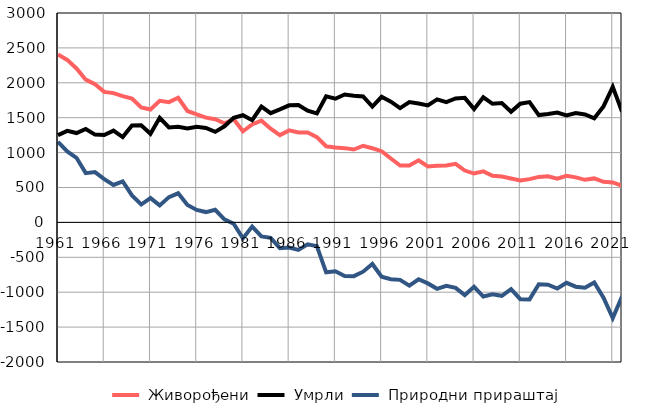
| Category |  Живорођени |  Умрли |  Природни прираштај |
|---|---|---|---|
| 1961.0 | 2405 | 1251 | 1154 |
| 1962.0 | 2328 | 1312 | 1016 |
| 1963.0 | 2205 | 1280 | 925 |
| 1964.0 | 2045 | 1339 | 706 |
| 1965.0 | 1979 | 1258 | 721 |
| 1966.0 | 1870 | 1251 | 619 |
| 1967.0 | 1852 | 1315 | 537 |
| 1968.0 | 1810 | 1222 | 588 |
| 1969.0 | 1774 | 1387 | 387 |
| 1970.0 | 1647 | 1391 | 256 |
| 1971.0 | 1618 | 1270 | 348 |
| 1972.0 | 1742 | 1499 | 243 |
| 1973.0 | 1723 | 1361 | 362 |
| 1974.0 | 1786 | 1369 | 417 |
| 1975.0 | 1596 | 1346 | 250 |
| 1976.0 | 1549 | 1371 | 178 |
| 1977.0 | 1501 | 1353 | 148 |
| 1978.0 | 1478 | 1297 | 181 |
| 1979.0 | 1420 | 1377 | 43 |
| 1980.0 | 1479 | 1499 | -20 |
| 1981.0 | 1306 | 1535 | -229 |
| 1982.0 | 1404 | 1464 | -60 |
| 1983.0 | 1458 | 1659 | -201 |
| 1984.0 | 1343 | 1565 | -222 |
| 1985.0 | 1250 | 1619 | -369 |
| 1986.0 | 1318 | 1677 | -359 |
| 1987.0 | 1288 | 1682 | -394 |
| 1988.0 | 1287 | 1601 | -314 |
| 1989.0 | 1222 | 1562 | -340 |
| 1990.0 | 1091 | 1806 | -715 |
| 1991.0 | 1073 | 1772 | -699 |
| 1992.0 | 1064 | 1833 | -769 |
| 1993.0 | 1044 | 1814 | -770 |
| 1994.0 | 1098 | 1804 | -706 |
| 1995.0 | 1062 | 1658 | -596 |
| 1996.0 | 1020 | 1799 | -779 |
| 1997.0 | 916 | 1730 | -814 |
| 1998.0 | 814 | 1637 | -823 |
| 1999.0 | 816 | 1723 | -907 |
| 2000.0 | 889 | 1704 | -815 |
| 2001.0 | 801 | 1675 | -874 |
| 2002.0 | 812 | 1763 | -951 |
| 2003.0 | 814 | 1722 | -908 |
| 2004.0 | 839 | 1776 | -937 |
| 2005.0 | 743 | 1784 | -1041 |
| 2006.0 | 700 | 1623 | -923 |
| 2007.0 | 731 | 1793 | -1062 |
| 2008.0 | 668 | 1699 | -1031 |
| 2009.0 | 658 | 1710 | -1052 |
| 2010.0 | 630 | 1586 | -956 |
| 2011.0 | 601 | 1701 | -1100 |
| 2012.0 | 620 | 1723 | -1103 |
| 2013.0 | 652 | 1538 | -886 |
| 2014.0 | 661 | 1554 | -893 |
| 2015.0 | 627 | 1574 | -947 |
| 2016.0 | 667 | 1533 | -866 |
| 2017.0 | 645 | 1566 | -921 |
| 2018.0 | 610 | 1547 | -937 |
| 2019.0 | 630 | 1492 | -862 |
| 2020.0 | 582 | 1662 | -1080 |
| 2021.0 | 572 | 1943 | -1371 |
| 2022.0 | 524 | 1587 | -1063 |